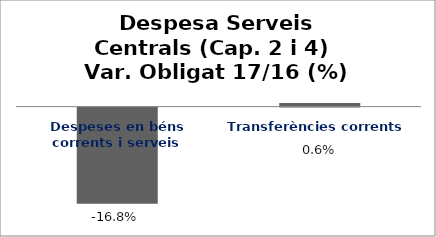
| Category | Series 0 |
|---|---|
| Despeses en béns corrents i serveis | -0.168 |
| Transferències corrents | 0.006 |